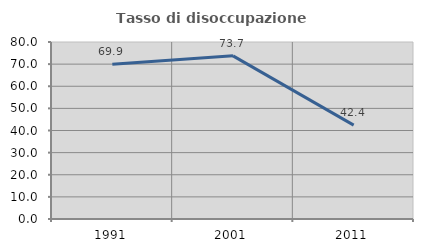
| Category | Tasso di disoccupazione giovanile  |
|---|---|
| 1991.0 | 69.908 |
| 2001.0 | 73.744 |
| 2011.0 | 42.448 |